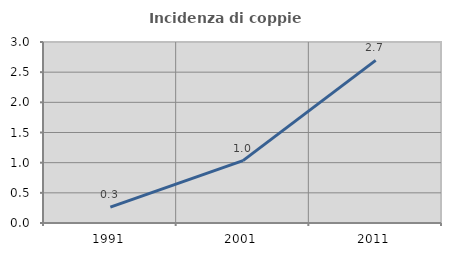
| Category | Incidenza di coppie miste |
|---|---|
| 1991.0 | 0.263 |
| 2001.0 | 1.035 |
| 2011.0 | 2.696 |